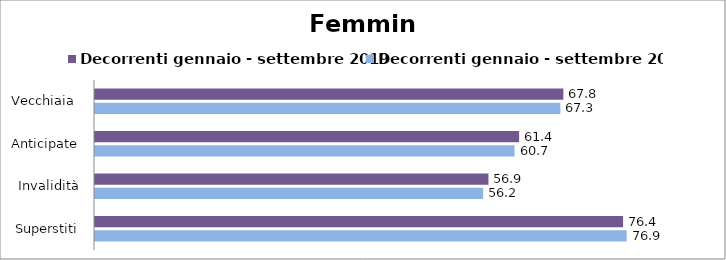
| Category | Decorrenti gennaio - settembre 2019 | Decorrenti gennaio - settembre 2020 |
|---|---|---|
| Vecchiaia  | 67.77 | 67.33 |
| Anticipate | 61.37 | 60.71 |
| Invalidità | 56.93 | 56.16 |
| Superstiti | 76.41 | 76.93 |